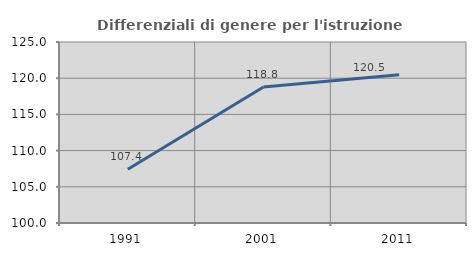
| Category | Differenziali di genere per l'istruzione superiore |
|---|---|
| 1991.0 | 107.424 |
| 2001.0 | 118.778 |
| 2011.0 | 120.475 |